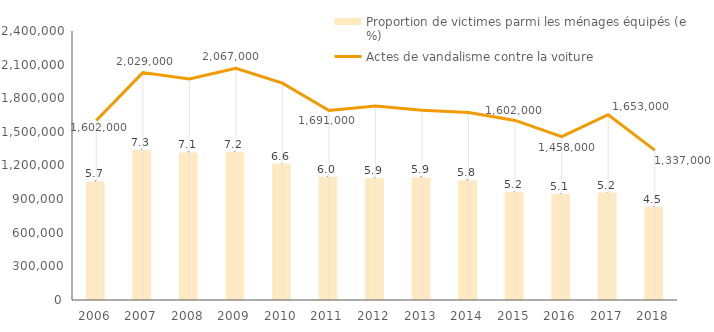
| Category | Proportion de victimes parmi les ménages équipés (en %) |
|---|---|
| 2006.0 | 5.731 |
| 2007.0 | 7.251 |
| 2008.0 | 7.134 |
| 2009.0 | 7.151 |
| 2010.0 | 6.596 |
| 2011.0 | 5.961 |
| 2012.0 | 5.888 |
| 2013.0 | 5.925 |
| 2014.0 | 5.781 |
| 2015.0 | 5.23 |
| 2016.0 | 5.13 |
| 2017.0 | 5.189 |
| 2018.0 | 4.512 |